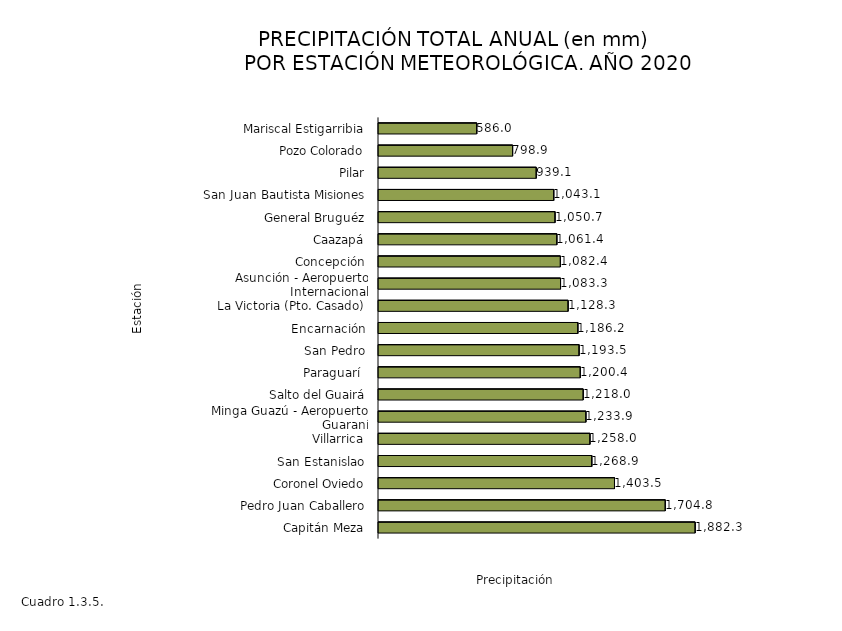
| Category | Series 0 |
|---|---|
| Capitán Meza | 1882.3 |
| Pedro Juan Caballero | 1704.8 |
| Coronel Oviedo | 1403.5 |
| San Estanislao | 1268.9 |
| Villarrica | 1258 |
| Minga Guazú - Aeropuerto Guaraní | 1233.9 |
| Salto del Guairá | 1218 |
| Paraguarí  | 1200.4 |
| San Pedro | 1193.5 |
| Encarnación | 1186.2 |
| La Victoria (Pto. Casado) | 1128.3 |
| Asunción - Aeropuerto Internacional | 1083.3 |
| Concepción | 1082.4 |
| Caazapá | 1061.4 |
| General Bruguéz | 1050.7 |
| San Juan Bautista Misiones | 1043.1 |
| Pilar | 939.1 |
| Pozo Colorado | 798.9 |
| Mariscal Estigarribia | 586 |